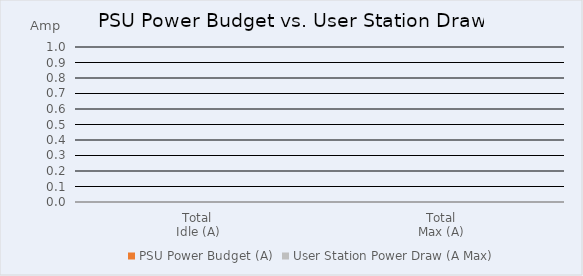
| Category | PSU Power Budget (A) | User Station Power Draw (A Max) |
|---|---|---|
| Total
Idle (A) | 0 | 0 |
| Total
Max (A) | 0 | 0 |